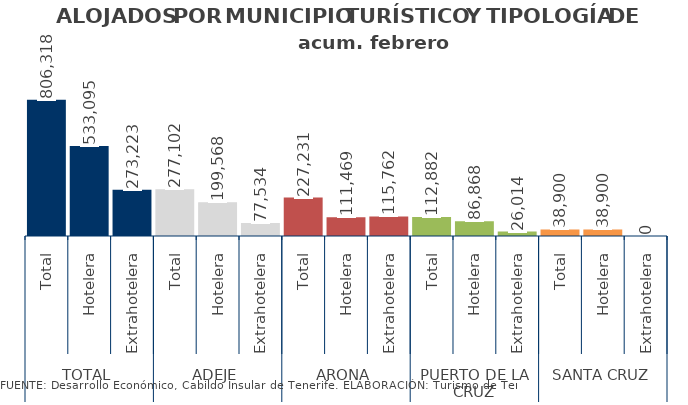
| Category | acum. febrero 2014 |
|---|---|
| 0 | 806318 |
| 1 | 533095 |
| 2 | 273223 |
| 3 | 277102 |
| 4 | 199568 |
| 5 | 77534 |
| 6 | 227231 |
| 7 | 111469 |
| 8 | 115762 |
| 9 | 112882 |
| 10 | 86868 |
| 11 | 26014 |
| 12 | 38900 |
| 13 | 38900 |
| 14 | 0 |